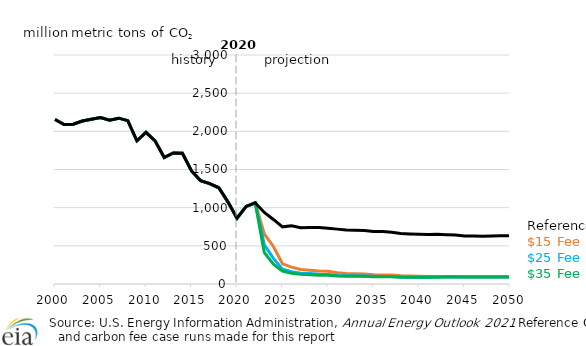
| Category | $15 Fee case | $25 Fee case | $35 Fee case | Reference |
|---|---|---|---|---|
| 2000.0 | 2155.807 | 2155.807 | 2155.807 | 2155.807 |
| 2001.0 | 2088.293 | 2088.293 | 2088.293 | 2088.293 |
| 2002.0 | 2093.927 | 2093.927 | 2093.927 | 2093.927 |
| 2003.0 | 2134.993 | 2134.993 | 2134.993 | 2134.993 |
| 2004.0 | 2159.53 | 2159.53 | 2159.53 | 2159.53 |
| 2005.0 | 2181.273 | 2181.273 | 2181.273 | 2181.273 |
| 2006.0 | 2147.077 | 2147.077 | 2147.077 | 2147.077 |
| 2007.0 | 2172.37 | 2172.37 | 2172.37 | 2172.37 |
| 2008.0 | 2139.739 | 2139.739 | 2139.739 | 2139.739 |
| 2009.0 | 1875.735 | 1875.735 | 1875.735 | 1875.735 |
| 2010.0 | 1985.865 | 1985.865 | 1985.865 | 1985.865 |
| 2011.0 | 1875.481 | 1875.481 | 1875.481 | 1875.481 |
| 2012.0 | 1656.981 | 1656.981 | 1656.981 | 1656.981 |
| 2013.0 | 1717.531 | 1717.531 | 1717.531 | 1717.531 |
| 2014.0 | 1713.611 | 1713.611 | 1713.611 | 1713.611 |
| 2015.0 | 1480.388 | 1480.388 | 1480.388 | 1480.388 |
| 2016.0 | 1354.216 | 1354.216 | 1354.216 | 1354.216 |
| 2017.0 | 1316.035 | 1316.035 | 1316.035 | 1316.035 |
| 2018.0 | 1260.293 | 1260.293 | 1260.293 | 1260.293 |
| 2019.0 | 1075.941 | 1075.941 | 1075.941 | 1075.941 |
| 2020.0 | 861.155 | 861.155 | 861.155 | 861.155 |
| 2021.0 | 1014.239 | 1014.146 | 1014.345 | 1016.42 |
| 2022.0 | 1063.765 | 1064.011 | 1062.154 | 1063.995 |
| 2023.0 | 655.536 | 513.117 | 412.154 | 937.863 |
| 2024.0 | 492.198 | 335.937 | 260.934 | 845.771 |
| 2025.0 | 264.823 | 193.63 | 169.436 | 748.667 |
| 2026.0 | 220.722 | 161.957 | 141.501 | 763.681 |
| 2027.0 | 189.481 | 141.171 | 127.964 | 738.502 |
| 2028.0 | 180.33 | 136.195 | 122.403 | 741.522 |
| 2029.0 | 171.172 | 128.889 | 116.054 | 740.908 |
| 2030.0 | 166.687 | 125.105 | 114.523 | 731.331 |
| 2031.0 | 146.452 | 110.402 | 106.233 | 718.869 |
| 2032.0 | 137.39 | 107.219 | 102.311 | 706.629 |
| 2033.0 | 135.918 | 107.72 | 102.276 | 704.081 |
| 2034.0 | 130.583 | 104.617 | 100.391 | 702.227 |
| 2035.0 | 121.265 | 101.168 | 96.451 | 688.292 |
| 2036.0 | 118.449 | 98.529 | 95.795 | 686.528 |
| 2037.0 | 116.893 | 98.032 | 95.534 | 677.723 |
| 2038.0 | 107.188 | 90.943 | 89.091 | 660.495 |
| 2039.0 | 104.214 | 89.971 | 89.105 | 655.312 |
| 2040.0 | 101.413 | 89.334 | 88.491 | 652.677 |
| 2041.0 | 98.627 | 89.562 | 88.54 | 649.45 |
| 2042.0 | 97.368 | 90.914 | 89.74 | 651.194 |
| 2043.0 | 97.261 | 92.401 | 91.162 | 646.095 |
| 2044.0 | 96.98 | 92.498 | 91.036 | 642.298 |
| 2045.0 | 96.084 | 92.737 | 91.613 | 630.394 |
| 2046.0 | 95.665 | 92.755 | 90.965 | 627.662 |
| 2047.0 | 94.829 | 92.402 | 90.66 | 626.721 |
| 2048.0 | 94.527 | 92.087 | 91.151 | 630.106 |
| 2049.0 | 94.375 | 92.117 | 90.987 | 632.114 |
| 2050.0 | 94.83 | 92.739 | 91.444 | 631.452 |